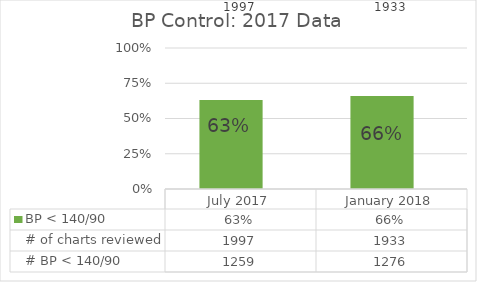
| Category | BP < 140/90 | # of charts reviewed | # BP < 140/90 |
|---|---|---|---|
| July 2017 | 0.63 | 1997 | 1259 |
| January 2018 | 0.66 | 1933 | 1276 |